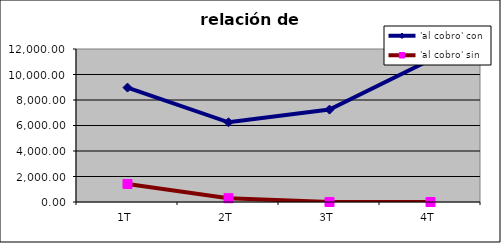
| Category | 'al cobro' con | 'al cobro' sin |
|---|---|---|
| 1T | 8975.05 | 1415 |
| 2T | 6250.25 | 300 |
| 3T | 7247.3 | 0 |
| 4T | 11160.35 | 0 |